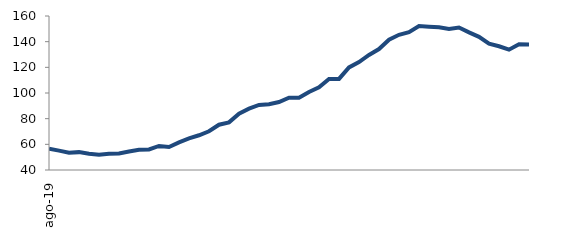
| Category | Series 0 |
|---|---|
| 2019-08-01 | 56.658 |
| 2019-09-01 | 55.107 |
| 2019-10-01 | 53.41 |
| 2019-11-01 | 53.924 |
| 2019-12-01 | 52.607 |
| 2020-01-01 | 51.869 |
| 2020-02-01 | 52.619 |
| 2020-03-01 | 52.83 |
| 2020-04-01 | 54.43 |
| 2020-05-01 | 55.851 |
| 2020-06-01 | 56.062 |
| 2020-07-01 | 58.766 |
| 2020-08-01 | 57.967 |
| 2020-09-01 | 61.563 |
| 2020-10-01 | 64.611 |
| 2020-11-01 | 67.053 |
| 2020-12-01 | 70.207 |
| 2021-01-01 | 75.283 |
| 2021-02-01 | 77.125 |
| 2021-03-01 | 83.917 |
| 2021-04-01 | 87.772 |
| 2021-05-01 | 90.698 |
| 2021-06-01 | 91.254 |
| 2021-07-01 | 92.957 |
| 2021-08-01 | 96.281 |
| 2021-09-01 | 96.228 |
| 2021-10-01 | 100.807 |
| 2021-11-01 | 104.506 |
| 2021-12-01 | 110.93 |
| 2022-01-01 | 110.966 |
| 2022-02-01 | 119.928 |
| 2022-03-01 | 124.133 |
| 2022-04-01 | 129.687 |
| 2022-05-01 | 134.267 |
| 2022-06-01 | 141.471 |
| 2022-07-01 | 145.357 |
| 2022-08-01 | 147.378 |
| 2022-09-01 | 152.132 |
| 2022-10-01 | 151.659 |
| 2022-11-01 | 151.229 |
| 2022-12-01 | 149.84 |
| 2023-01-01 | 151.047 |
| 2023-02-01 | 147.233 |
| 2023-03-01 | 143.736 |
| 2023-04-01 | 138.403 |
| 2023-05-01 | 136.434 |
| 2023-06-01 | 133.747 |
| 2023-07-01 | 138.012 |
| 2023-08-01 | 137.887 |